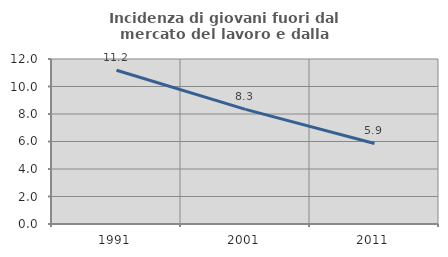
| Category | Incidenza di giovani fuori dal mercato del lavoro e dalla formazione  |
|---|---|
| 1991.0 | 11.184 |
| 2001.0 | 8.333 |
| 2011.0 | 5.859 |